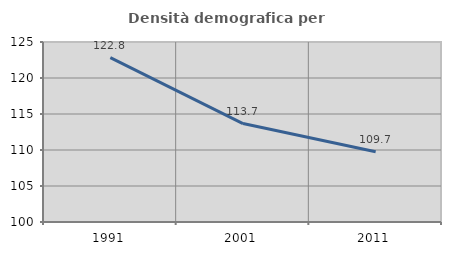
| Category | Densità demografica |
|---|---|
| 1991.0 | 122.821 |
| 2001.0 | 113.673 |
| 2011.0 | 109.747 |